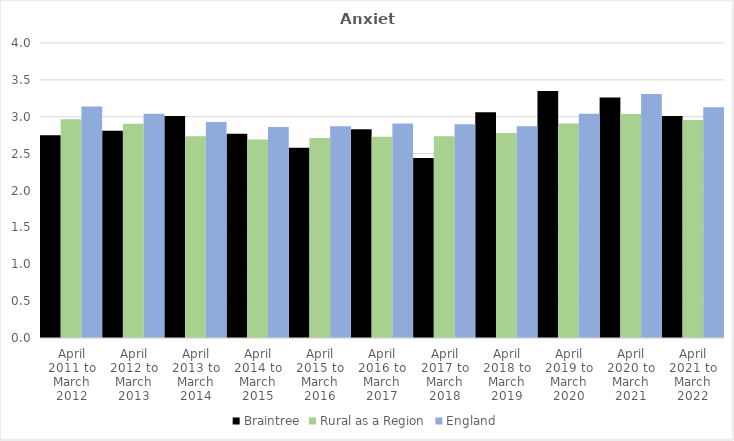
| Category | Braintree | Rural as a Region | England |
|---|---|---|---|
| April 2011 to March 2012 | 2.75 | 2.967 | 3.14 |
| April 2012 to March 2013 | 2.81 | 2.904 | 3.04 |
| April 2013 to March 2014 | 3.01 | 2.734 | 2.93 |
| April 2014 to March 2015 | 2.77 | 2.691 | 2.86 |
| April 2015 to March 2016 | 2.58 | 2.711 | 2.87 |
| April 2016 to March 2017 | 2.83 | 2.729 | 2.91 |
| April 2017 to March 2018 | 2.44 | 2.736 | 2.9 |
| April 2018 to March 2019 | 3.06 | 2.78 | 2.87 |
| April 2019 to March 2020 | 3.35 | 2.908 | 3.04 |
| April 2020 to March 2021 | 3.26 | 3.036 | 3.31 |
| April 2021 to March 2022 | 3.01 | 2.956 | 3.13 |